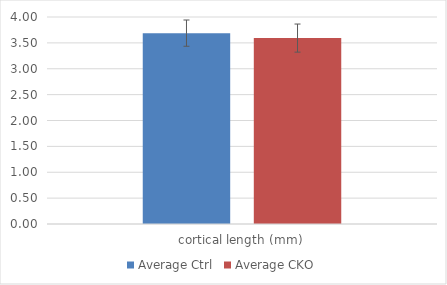
| Category | Average Ctrl | Average CKO |
|---|---|---|
| cortical length (mm) | 3.688 | 3.593 |